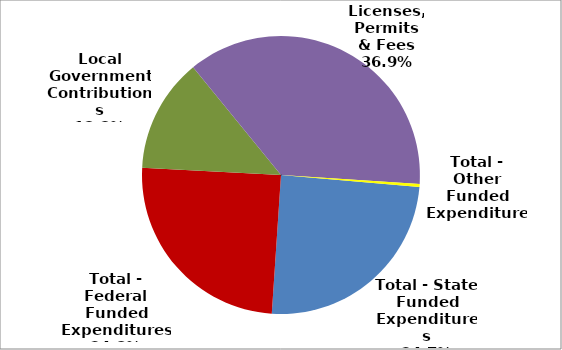
| Category | Series 0 |
|---|---|
| Total - State Funded Expenditures | 1263735 |
| Total - Federal Funded Expenditures | 1269341 |
| Local Government Contributions | 679776 |
| Licenses, Permits & Fees | 1892042 |
| Total - Other Funded Expenditures | 18121 |